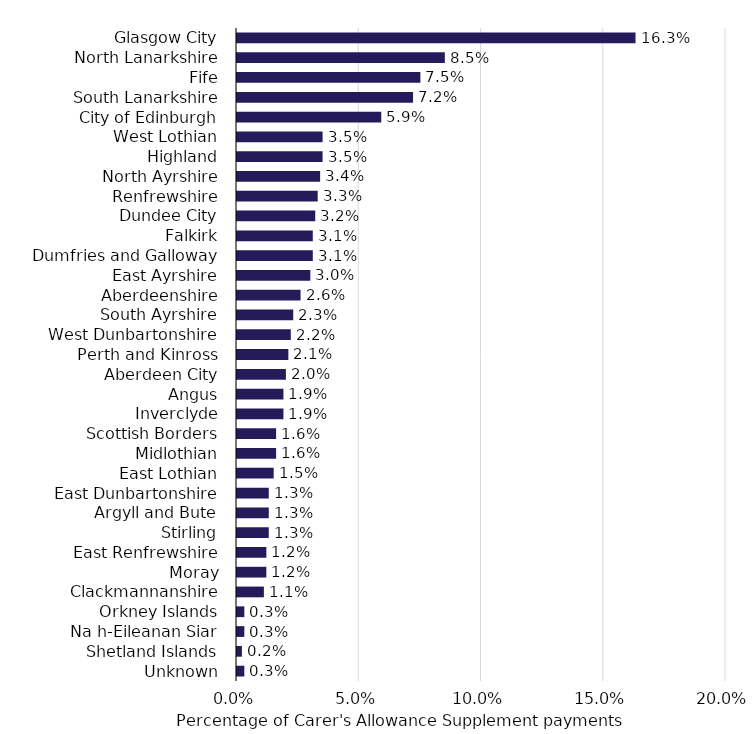
| Category | October Eligibiltiy |
|---|---|
| Glasgow City | 0.163 |
| North Lanarkshire | 0.085 |
| Fife | 0.075 |
| South Lanarkshire | 0.072 |
| City of Edinburgh | 0.059 |
| West Lothian | 0.035 |
| Highland | 0.035 |
| North Ayrshire | 0.034 |
| Renfrewshire | 0.033 |
| Dundee City | 0.032 |
| Falkirk | 0.031 |
| Dumfries and Galloway | 0.031 |
| East Ayrshire | 0.03 |
| Aberdeenshire | 0.026 |
| South Ayrshire | 0.023 |
| West Dunbartonshire | 0.022 |
| Perth and Kinross | 0.021 |
| Aberdeen City | 0.02 |
| Angus | 0.019 |
| Inverclyde | 0.019 |
| Scottish Borders | 0.016 |
| Midlothian | 0.016 |
| East Lothian | 0.015 |
| East Dunbartonshire | 0.013 |
| Argyll and Bute | 0.013 |
| Stirling | 0.013 |
| East Renfrewshire | 0.012 |
| Moray | 0.012 |
| Clackmannanshire | 0.011 |
| Orkney Islands | 0.003 |
| Na h-Eileanan Siar | 0.003 |
| Shetland Islands | 0.002 |
| Unknown | 0.003 |